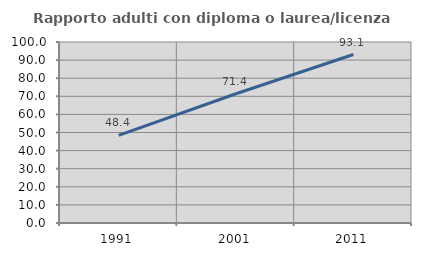
| Category | Rapporto adulti con diploma o laurea/licenza media  |
|---|---|
| 1991.0 | 48.387 |
| 2001.0 | 71.429 |
| 2011.0 | 93.082 |